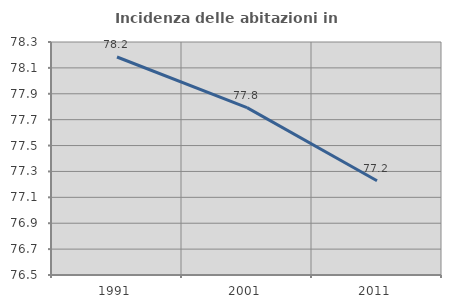
| Category | Incidenza delle abitazioni in proprietà  |
|---|---|
| 1991.0 | 78.184 |
| 2001.0 | 77.793 |
| 2011.0 | 77.229 |